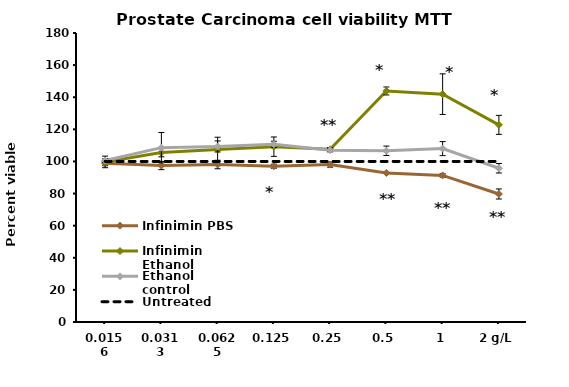
| Category | Infinimin PBS | Infinimin Ethanol | Ethanol control | Untreated |
|---|---|---|---|---|
| 0.0156 | 98.898 | 99.708 | 100.562 | 100 |
| 0.0313 | 97.458 | 105.512 | 108.594 | 100 |
| 0.0625 | 98.088 | 107.447 | 109.336 | 100 |
| 0.125 | 97.008 | 109.201 | 110.686 | 100 |
| 0.25 | 98.043 | 107.537 | 107.042 | 100 |
| 0.5 | 92.868 | 143.892 | 106.637 | 100 |
| 1 | 91.316 | 141.912 | 107.987 | 100 |
| 2 g/L | 79.73 | 122.79 | 95.771 | 100 |